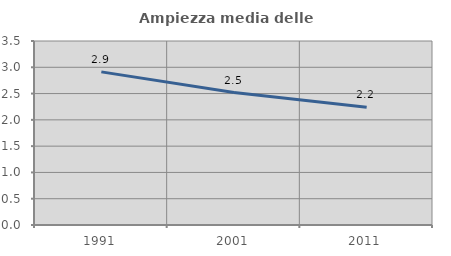
| Category | Ampiezza media delle famiglie |
|---|---|
| 1991.0 | 2.913 |
| 2001.0 | 2.519 |
| 2011.0 | 2.241 |